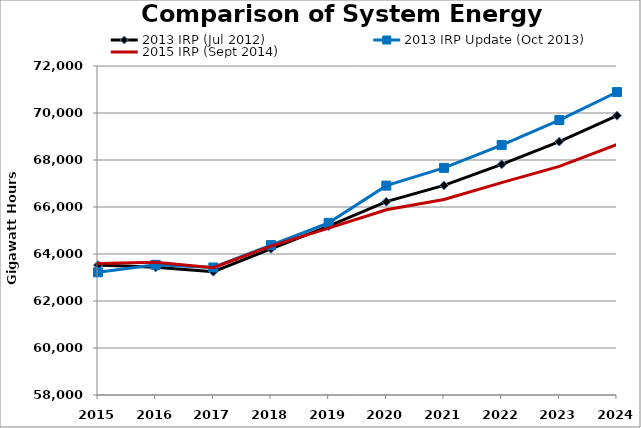
| Category | 2013 IRP (Jul 2012) | 2013 IRP Update (Oct 2013) | 2015 IRP (Sept 2014) |
|---|---|---|---|
| 2015.0 | 63527.998 | 63220.77 | 63594 |
| 2016.0 | 63431.505 | 63543.02 | 63644.16 |
| 2017.0 | 63246.311 | 63426.04 | 63414.41 |
| 2018.0 | 64219.328 | 64379 | 64335.67 |
| 2019.0 | 65183.187 | 65325.36 | 65099.11 |
| 2020.0 | 66226.672 | 66909.69 | 65882.15 |
| 2021.0 | 66917.769 | 67665.77 | 66317.89 |
| 2022.0 | 67814.244 | 68636.57 | 67038.44 |
| 2023.0 | 68781.288 | 69701.02 | 67731.04 |
| 2024.0 | 69883.885 | 70890.72 | 68656.72 |